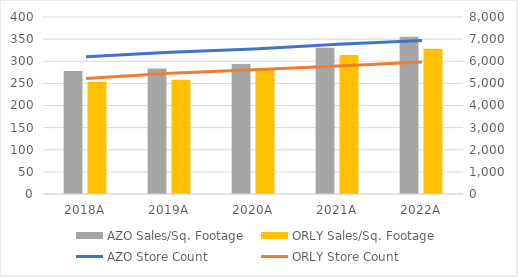
| Category | AZO Sales/Sq. Footage | ORLY Sales/Sq. Footage |
|---|---|---|
| 2018.0 | 277.92 | 253.83 |
| 2019.0 | 283.85 | 258 |
| 2020.0 | 293.67 | 283.4 |
| 2021.0 | 330.39 | 314.13 |
| 2022.0 | 355.27 | 328.28 |